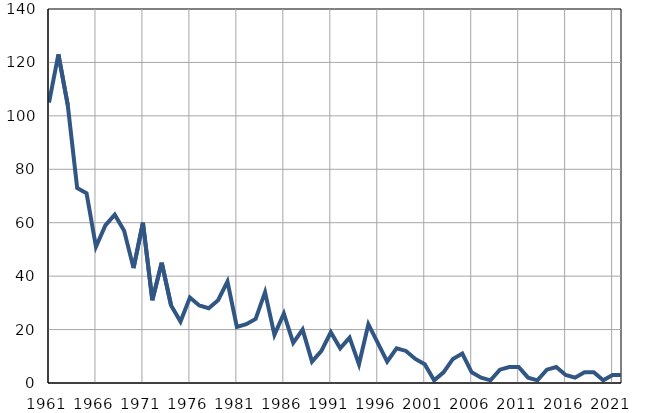
| Category | Умрла 
одојчад |
|---|---|
| 1961.0 | 105 |
| 1962.0 | 123 |
| 1963.0 | 104 |
| 1964.0 | 73 |
| 1965.0 | 71 |
| 1966.0 | 51 |
| 1967.0 | 59 |
| 1968.0 | 63 |
| 1969.0 | 57 |
| 1970.0 | 43 |
| 1971.0 | 60 |
| 1972.0 | 31 |
| 1973.0 | 45 |
| 1974.0 | 29 |
| 1975.0 | 23 |
| 1976.0 | 32 |
| 1977.0 | 29 |
| 1978.0 | 28 |
| 1979.0 | 31 |
| 1980.0 | 38 |
| 1981.0 | 21 |
| 1982.0 | 22 |
| 1983.0 | 24 |
| 1984.0 | 34 |
| 1985.0 | 18 |
| 1986.0 | 26 |
| 1987.0 | 15 |
| 1988.0 | 20 |
| 1989.0 | 8 |
| 1990.0 | 12 |
| 1991.0 | 19 |
| 1992.0 | 13 |
| 1993.0 | 17 |
| 1994.0 | 7 |
| 1995.0 | 22 |
| 1996.0 | 15 |
| 1997.0 | 8 |
| 1998.0 | 13 |
| 1999.0 | 12 |
| 2000.0 | 9 |
| 2001.0 | 7 |
| 2002.0 | 1 |
| 2003.0 | 4 |
| 2004.0 | 9 |
| 2005.0 | 11 |
| 2006.0 | 4 |
| 2007.0 | 2 |
| 2008.0 | 1 |
| 2009.0 | 5 |
| 2010.0 | 6 |
| 2011.0 | 6 |
| 2012.0 | 2 |
| 2013.0 | 1 |
| 2014.0 | 5 |
| 2015.0 | 6 |
| 2016.0 | 3 |
| 2017.0 | 2 |
| 2018.0 | 4 |
| 2019.0 | 4 |
| 2020.0 | 1 |
| 2021.0 | 3 |
| 2022.0 | 3 |